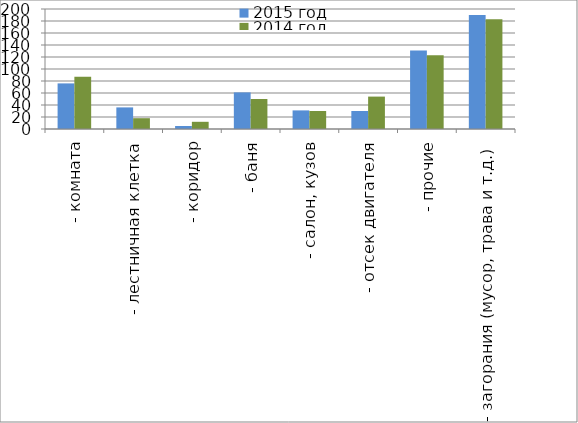
| Category | 2015 год | 2014 год |
|---|---|---|
|  - комната | 76 | 87 |
|  - лестничная клетка | 36 | 18 |
|  - коридор | 5 | 12 |
|  - баня | 61 | 50 |
|  - салон, кузов | 31 | 30 |
|  - отсек двигателя | 30 | 54 |
| - прочие | 131 | 123 |
| - загорания (мусор, трава и т.д.)  | 190 | 183 |